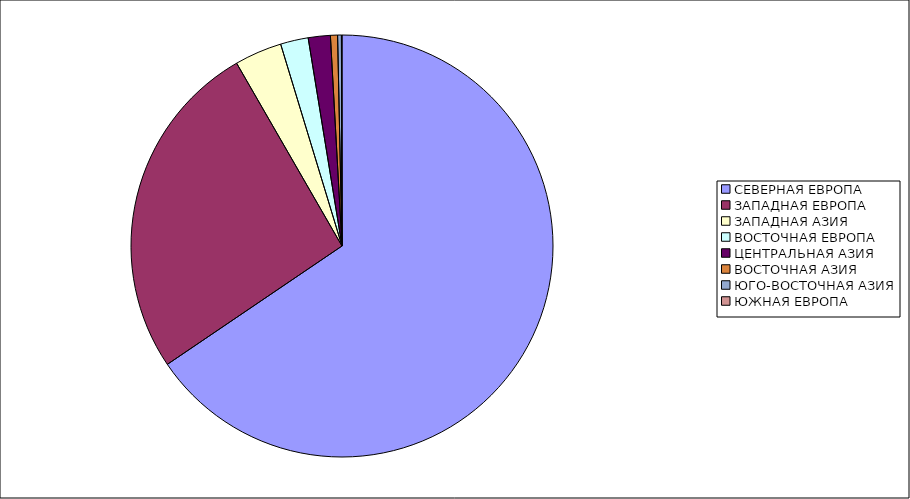
| Category | Оборот |
|---|---|
| СЕВЕРНАЯ ЕВРОПА | 65.519 |
| ЗАПАДНАЯ ЕВРОПА | 26.155 |
| ЗАПАДНАЯ АЗИЯ | 3.63 |
| ВОСТОЧНАЯ ЕВРОПА | 2.128 |
| ЦЕНТРАЛЬНАЯ АЗИЯ | 1.689 |
| ВОСТОЧНАЯ АЗИЯ | 0.545 |
| ЮГО-ВОСТОЧНАЯ АЗИЯ | 0.289 |
| ЮЖНАЯ ЕВРОПА | 0.044 |